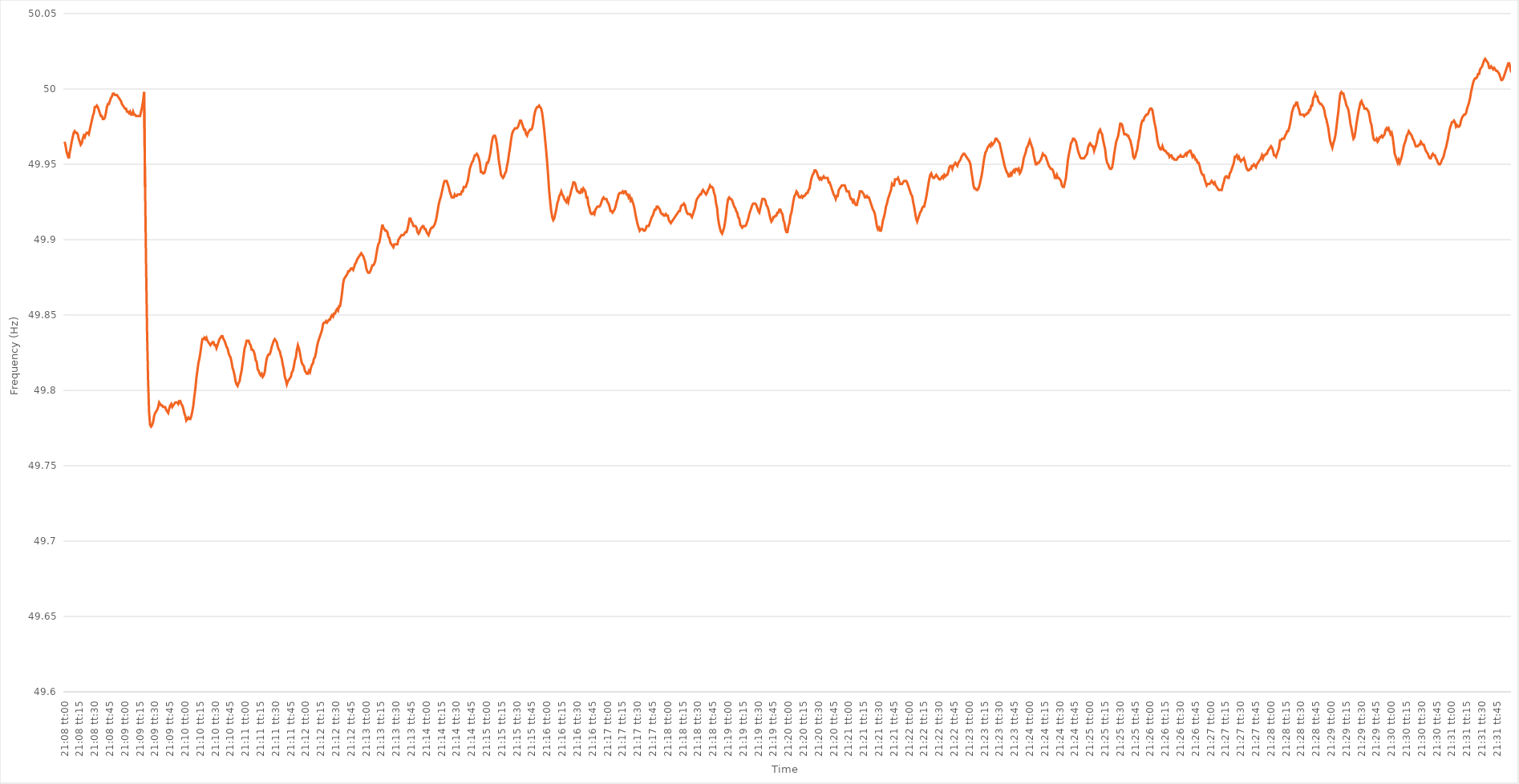
| Category | Series 0 |
|---|---|
| 0.8805555555555555 | 49.965 |
| 0.8805671296296297 | 49.962 |
| 0.8805787037037037 | 49.958 |
| 0.8805902777777778 | 49.956 |
| 0.8806018518518518 | 49.954 |
| 0.880613425925926 | 49.958 |
| 0.8806250000000001 | 49.961 |
| 0.880636574074074 | 49.965 |
| 0.8806481481481482 | 49.968 |
| 0.8806597222222222 | 49.971 |
| 0.8806712962962964 | 49.972 |
| 0.8806828703703703 | 49.971 |
| 0.8806944444444444 | 49.971 |
| 0.8807060185185186 | 49.97 |
| 0.8807175925925925 | 49.967 |
| 0.8807291666666667 | 49.965 |
| 0.8807407407407407 | 49.963 |
| 0.8807523148148149 | 49.964 |
| 0.8807638888888888 | 49.967 |
| 0.8807754629629629 | 49.969 |
| 0.8807870370370371 | 49.968 |
| 0.8807986111111111 | 49.97 |
| 0.8808101851851852 | 49.971 |
| 0.8808217592592592 | 49.971 |
| 0.8808333333333334 | 49.97 |
| 0.8808449074074075 | 49.973 |
| 0.8808564814814814 | 49.976 |
| 0.8808680555555556 | 49.979 |
| 0.8808796296296296 | 49.982 |
| 0.8808912037037038 | 49.984 |
| 0.8809027777777777 | 49.988 |
| 0.8809143518518519 | 49.988 |
| 0.880925925925926 | 49.989 |
| 0.8809374999999999 | 49.988 |
| 0.8809490740740741 | 49.986 |
| 0.8809606481481481 | 49.984 |
| 0.8809722222222223 | 49.982 |
| 0.8809837962962962 | 49.982 |
| 0.8809953703703703 | 49.98 |
| 0.8810069444444445 | 49.98 |
| 0.8810185185185185 | 49.981 |
| 0.8810300925925926 | 49.984 |
| 0.8810416666666666 | 49.988 |
| 0.8810532407407408 | 49.99 |
| 0.8810648148148149 | 49.99 |
| 0.8810763888888888 | 49.992 |
| 0.881087962962963 | 49.994 |
| 0.881099537037037 | 49.995 |
| 0.8811111111111112 | 49.997 |
| 0.8811226851851851 | 49.997 |
| 0.8811342592592593 | 49.996 |
| 0.8811458333333334 | 49.996 |
| 0.8811574074074073 | 49.996 |
| 0.8811689814814815 | 49.995 |
| 0.8811805555555555 | 49.994 |
| 0.8811921296296297 | 49.993 |
| 0.8812037037037036 | 49.992 |
| 0.8812152777777778 | 49.99 |
| 0.8812268518518519 | 49.989 |
| 0.8812384259259259 | 49.988 |
| 0.88125 | 49.987 |
| 0.881261574074074 | 49.987 |
| 0.8812731481481482 | 49.985 |
| 0.8812847222222223 | 49.985 |
| 0.8812962962962962 | 49.984 |
| 0.8813078703703704 | 49.985 |
| 0.8813194444444444 | 49.983 |
| 0.8813310185185186 | 49.983 |
| 0.8813425925925925 | 49.985 |
| 0.8813541666666667 | 49.983 |
| 0.8813657407407408 | 49.983 |
| 0.8813773148148148 | 49.982 |
| 0.8813888888888889 | 49.982 |
| 0.8814004629629629 | 49.982 |
| 0.8814120370370371 | 49.982 |
| 0.881423611111111 | 49.982 |
| 0.8814351851851852 | 49.985 |
| 0.8814467592592593 | 49.988 |
| 0.8814583333333333 | 49.992 |
| 0.8814699074074074 | 49.998 |
| 0.8814814814814814 | 49.935 |
| 0.8814930555555556 | 49.883 |
| 0.8815046296296297 | 49.838 |
| 0.8815162037037036 | 49.806 |
| 0.8815277777777778 | 49.785 |
| 0.8815393518518518 | 49.777 |
| 0.881550925925926 | 49.776 |
| 0.8815624999999999 | 49.777 |
| 0.8815740740740741 | 49.779 |
| 0.8815856481481482 | 49.783 |
| 0.8815972222222223 | 49.785 |
| 0.8816087962962963 | 49.786 |
| 0.8816203703703703 | 49.787 |
| 0.8816319444444445 | 49.789 |
| 0.8816435185185184 | 49.792 |
| 0.8816550925925926 | 49.791 |
| 0.8816666666666667 | 49.79 |
| 0.8816782407407407 | 49.79 |
| 0.8816898148148148 | 49.789 |
| 0.8817013888888888 | 49.789 |
| 0.881712962962963 | 49.789 |
| 0.8817245370370371 | 49.787 |
| 0.881736111111111 | 49.786 |
| 0.8817476851851852 | 49.785 |
| 0.8817592592592592 | 49.788 |
| 0.8817708333333334 | 49.79 |
| 0.8817824074074073 | 49.791 |
| 0.8817939814814815 | 49.789 |
| 0.8818055555555556 | 49.79 |
| 0.8818171296296297 | 49.791 |
| 0.8818287037037037 | 49.792 |
| 0.8818402777777777 | 49.792 |
| 0.8818518518518519 | 49.792 |
| 0.881863425925926 | 49.791 |
| 0.881875 | 49.793 |
| 0.8818865740740741 | 49.793 |
| 0.8818981481481482 | 49.791 |
| 0.8819097222222222 | 49.79 |
| 0.8819212962962962 | 49.788 |
| 0.8819328703703704 | 49.785 |
| 0.8819444444444445 | 49.783 |
| 0.8819560185185185 | 49.78 |
| 0.8819675925925926 | 49.781 |
| 0.8819791666666666 | 49.782 |
| 0.8819907407407408 | 49.781 |
| 0.8820023148148147 | 49.781 |
| 0.8820138888888889 | 49.783 |
| 0.882025462962963 | 49.786 |
| 0.8820370370370371 | 49.79 |
| 0.8820486111111111 | 49.796 |
| 0.8820601851851851 | 49.801 |
| 0.8820717592592593 | 49.808 |
| 0.8820833333333334 | 49.813 |
| 0.8820949074074074 | 49.818 |
| 0.8821064814814815 | 49.821 |
| 0.8821180555555556 | 49.825 |
| 0.8821296296296296 | 49.83 |
| 0.8821412037037036 | 49.834 |
| 0.8821527777777778 | 49.834 |
| 0.8821643518518519 | 49.835 |
| 0.8821759259259259 | 49.834 |
| 0.8821875 | 49.835 |
| 0.882199074074074 | 49.833 |
| 0.8822106481481482 | 49.832 |
| 0.8822222222222221 | 49.831 |
| 0.8822337962962963 | 49.83 |
| 0.8822453703703704 | 49.831 |
| 0.8822569444444445 | 49.832 |
| 0.8822685185185185 | 49.832 |
| 0.8822800925925925 | 49.83 |
| 0.8822916666666667 | 49.83 |
| 0.8823032407407408 | 49.828 |
| 0.8823148148148148 | 49.83 |
| 0.8823263888888889 | 49.832 |
| 0.882337962962963 | 49.834 |
| 0.882349537037037 | 49.835 |
| 0.882361111111111 | 49.836 |
| 0.8823726851851852 | 49.836 |
| 0.8823842592592593 | 49.834 |
| 0.8823958333333333 | 49.833 |
| 0.8824074074074074 | 49.831 |
| 0.8824189814814815 | 49.829 |
| 0.8824305555555556 | 49.828 |
| 0.8824421296296295 | 49.825 |
| 0.8824537037037037 | 49.823 |
| 0.8824652777777778 | 49.822 |
| 0.8824768518518519 | 49.819 |
| 0.8824884259259259 | 49.815 |
| 0.8825 | 49.813 |
| 0.8825115740740741 | 49.81 |
| 0.8825231481481483 | 49.806 |
| 0.8825347222222222 | 49.804 |
| 0.8825462962962963 | 49.803 |
| 0.8825578703703704 | 49.805 |
| 0.8825694444444445 | 49.806 |
| 0.8825810185185184 | 49.81 |
| 0.8825925925925926 | 49.813 |
| 0.8826041666666667 | 49.818 |
| 0.8826157407407407 | 49.823 |
| 0.8826273148148148 | 49.828 |
| 0.8826388888888889 | 49.83 |
| 0.882650462962963 | 49.833 |
| 0.8826620370370369 | 49.833 |
| 0.8826736111111111 | 49.833 |
| 0.8826851851851852 | 49.831 |
| 0.8826967592592593 | 49.83 |
| 0.8827083333333333 | 49.827 |
| 0.8827199074074074 | 49.827 |
| 0.8827314814814815 | 49.826 |
| 0.8827430555555557 | 49.824 |
| 0.8827546296296296 | 49.82 |
| 0.8827662037037037 | 49.819 |
| 0.8827777777777778 | 49.814 |
| 0.8827893518518519 | 49.813 |
| 0.8828009259259259 | 49.811 |
| 0.8828125 | 49.81 |
| 0.8828240740740741 | 49.811 |
| 0.8828356481481481 | 49.809 |
| 0.8828472222222222 | 49.81 |
| 0.8828587962962963 | 49.812 |
| 0.8828703703703704 | 49.817 |
| 0.8828819444444443 | 49.821 |
| 0.8828935185185185 | 49.823 |
| 0.8829050925925926 | 49.824 |
| 0.8829166666666667 | 49.824 |
| 0.8829282407407407 | 49.826 |
| 0.8829398148148148 | 49.829 |
| 0.8829513888888889 | 49.831 |
| 0.8829629629629631 | 49.833 |
| 0.882974537037037 | 49.834 |
| 0.8829861111111111 | 49.833 |
| 0.8829976851851852 | 49.832 |
| 0.8830092592592593 | 49.829 |
| 0.8830208333333333 | 49.827 |
| 0.8830324074074074 | 49.826 |
| 0.8830439814814816 | 49.823 |
| 0.8830555555555555 | 49.821 |
| 0.8830671296296296 | 49.817 |
| 0.8830787037037037 | 49.814 |
| 0.8830902777777778 | 49.809 |
| 0.8831018518518517 | 49.807 |
| 0.8831134259259259 | 49.804 |
| 0.883125 | 49.806 |
| 0.8831365740740741 | 49.807 |
| 0.8831481481481481 | 49.808 |
| 0.8831597222222222 | 49.809 |
| 0.8831712962962963 | 49.812 |
| 0.8831828703703705 | 49.813 |
| 0.8831944444444444 | 49.816 |
| 0.8832060185185185 | 49.82 |
| 0.8832175925925926 | 49.822 |
| 0.8832291666666667 | 49.827 |
| 0.8832407407407407 | 49.83 |
| 0.8832523148148148 | 49.828 |
| 0.883263888888889 | 49.825 |
| 0.883275462962963 | 49.821 |
| 0.883287037037037 | 49.818 |
| 0.8832986111111111 | 49.817 |
| 0.8833101851851852 | 49.816 |
| 0.8833217592592592 | 49.813 |
| 0.8833333333333333 | 49.812 |
| 0.8833449074074075 | 49.811 |
| 0.8833564814814815 | 49.811 |
| 0.8833680555555555 | 49.813 |
| 0.8833796296296296 | 49.812 |
| 0.8833912037037037 | 49.815 |
| 0.8834027777777779 | 49.817 |
| 0.8834143518518518 | 49.818 |
| 0.883425925925926 | 49.821 |
| 0.8834375 | 49.822 |
| 0.8834490740740741 | 49.825 |
| 0.8834606481481481 | 49.829 |
| 0.8834722222222222 | 49.832 |
| 0.8834837962962964 | 49.834 |
| 0.8834953703703704 | 49.836 |
| 0.8835069444444444 | 49.838 |
| 0.8835185185185185 | 49.84 |
| 0.8835300925925926 | 49.844 |
| 0.8835416666666666 | 49.845 |
| 0.8835532407407407 | 49.845 |
| 0.8835648148148149 | 49.846 |
| 0.8835763888888889 | 49.845 |
| 0.8835879629629629 | 49.846 |
| 0.883599537037037 | 49.847 |
| 0.8836111111111111 | 49.847 |
| 0.8836226851851853 | 49.849 |
| 0.8836342592592592 | 49.85 |
| 0.8836458333333334 | 49.849 |
| 0.8836574074074074 | 49.851 |
| 0.8836689814814815 | 49.851 |
| 0.8836805555555555 | 49.853 |
| 0.8836921296296296 | 49.854 |
| 0.8837037037037038 | 49.853 |
| 0.8837152777777778 | 49.856 |
| 0.8837268518518518 | 49.856 |
| 0.8837384259259259 | 49.86 |
| 0.88375 | 49.865 |
| 0.883761574074074 | 49.871 |
| 0.8837731481481481 | 49.874 |
| 0.8837847222222223 | 49.875 |
| 0.8837962962962963 | 49.876 |
| 0.8838078703703703 | 49.877 |
| 0.8838194444444444 | 49.879 |
| 0.8838310185185185 | 49.879 |
| 0.8838425925925927 | 49.88 |
| 0.8838541666666666 | 49.881 |
| 0.8838657407407408 | 49.881 |
| 0.8838773148148148 | 49.88 |
| 0.883888888888889 | 49.882 |
| 0.8839004629629629 | 49.884 |
| 0.883912037037037 | 49.885 |
| 0.8839236111111112 | 49.887 |
| 0.8839351851851852 | 49.888 |
| 0.8839467592592593 | 49.889 |
| 0.8839583333333333 | 49.89 |
| 0.8839699074074074 | 49.891 |
| 0.8839814814814816 | 49.89 |
| 0.8839930555555555 | 49.889 |
| 0.8840046296296297 | 49.887 |
| 0.8840162037037037 | 49.885 |
| 0.8840277777777777 | 49.881 |
| 0.8840393518518518 | 49.879 |
| 0.8840509259259259 | 49.878 |
| 0.8840625000000001 | 49.878 |
| 0.884074074074074 | 49.879 |
| 0.8840856481481482 | 49.881 |
| 0.8840972222222222 | 49.883 |
| 0.8841087962962964 | 49.883 |
| 0.8841203703703703 | 49.884 |
| 0.8841319444444444 | 49.886 |
| 0.8841435185185186 | 49.89 |
| 0.8841550925925926 | 49.894 |
| 0.8841666666666667 | 49.897 |
| 0.8841782407407407 | 49.898 |
| 0.8841898148148148 | 49.902 |
| 0.884201388888889 | 49.906 |
| 0.8842129629629629 | 49.91 |
| 0.8842245370370371 | 49.908 |
| 0.8842361111111111 | 49.907 |
| 0.8842476851851852 | 49.906 |
| 0.8842592592592592 | 49.906 |
| 0.8842708333333333 | 49.905 |
| 0.8842824074074075 | 49.902 |
| 0.8842939814814814 | 49.901 |
| 0.8843055555555556 | 49.898 |
| 0.8843171296296296 | 49.897 |
| 0.8843287037037038 | 49.896 |
| 0.8843402777777777 | 49.895 |
| 0.8843518518518518 | 49.897 |
| 0.884363425925926 | 49.897 |
| 0.884375 | 49.897 |
| 0.8843865740740741 | 49.897 |
| 0.8843981481481481 | 49.9 |
| 0.8844097222222222 | 49.901 |
| 0.8844212962962964 | 49.902 |
| 0.8844328703703703 | 49.903 |
| 0.8844444444444445 | 49.903 |
| 0.8844560185185185 | 49.903 |
| 0.8844675925925927 | 49.904 |
| 0.8844791666666666 | 49.905 |
| 0.8844907407407407 | 49.905 |
| 0.8845023148148149 | 49.907 |
| 0.8845138888888888 | 49.91 |
| 0.884525462962963 | 49.914 |
| 0.884537037037037 | 49.914 |
| 0.8845486111111112 | 49.912 |
| 0.8845601851851851 | 49.911 |
| 0.8845717592592592 | 49.909 |
| 0.8845833333333334 | 49.909 |
| 0.8845949074074074 | 49.909 |
| 0.8846064814814815 | 49.908 |
| 0.8846180555555555 | 49.905 |
| 0.8846296296296297 | 49.904 |
| 0.8846412037037038 | 49.905 |
| 0.8846527777777777 | 49.907 |
| 0.8846643518518519 | 49.908 |
| 0.8846759259259259 | 49.909 |
| 0.8846875000000001 | 49.909 |
| 0.884699074074074 | 49.907 |
| 0.8847106481481481 | 49.907 |
| 0.8847222222222223 | 49.905 |
| 0.8847337962962962 | 49.904 |
| 0.8847453703703704 | 49.903 |
| 0.8847569444444444 | 49.905 |
| 0.8847685185185186 | 49.907 |
| 0.8847800925925925 | 49.908 |
| 0.8847916666666666 | 49.908 |
| 0.8848032407407408 | 49.909 |
| 0.8848148148148148 | 49.91 |
| 0.8848263888888889 | 49.912 |
| 0.8848379629629629 | 49.915 |
| 0.8848495370370371 | 49.919 |
| 0.8848611111111112 | 49.923 |
| 0.8848726851851851 | 49.926 |
| 0.8848842592592593 | 49.928 |
| 0.8848958333333333 | 49.931 |
| 0.8849074074074075 | 49.934 |
| 0.8849189814814814 | 49.937 |
| 0.8849305555555556 | 49.939 |
| 0.8849421296296297 | 49.939 |
| 0.8849537037037036 | 49.939 |
| 0.8849652777777778 | 49.937 |
| 0.8849768518518518 | 49.935 |
| 0.884988425925926 | 49.932 |
| 0.8849999999999999 | 49.93 |
| 0.885011574074074 | 49.928 |
| 0.8850231481481482 | 49.928 |
| 0.8850347222222222 | 49.928 |
| 0.8850462962962963 | 49.93 |
| 0.8850578703703703 | 49.929 |
| 0.8850694444444445 | 49.929 |
| 0.8850810185185186 | 49.93 |
| 0.8850925925925925 | 49.93 |
| 0.8851041666666667 | 49.93 |
| 0.8851157407407407 | 49.93 |
| 0.8851273148148149 | 49.932 |
| 0.8851388888888888 | 49.932 |
| 0.885150462962963 | 49.935 |
| 0.8851620370370371 | 49.935 |
| 0.8851736111111111 | 49.935 |
| 0.8851851851851852 | 49.937 |
| 0.8851967592592592 | 49.939 |
| 0.8852083333333334 | 49.943 |
| 0.8852199074074073 | 49.947 |
| 0.8852314814814815 | 49.949 |
| 0.8852430555555556 | 49.951 |
| 0.8852546296296296 | 49.952 |
| 0.8852662037037037 | 49.954 |
| 0.8852777777777777 | 49.956 |
| 0.8852893518518519 | 49.956 |
| 0.885300925925926 | 49.957 |
| 0.8853125 | 49.956 |
| 0.8853240740740741 | 49.954 |
| 0.8853356481481481 | 49.951 |
| 0.8853472222222223 | 49.945 |
| 0.8853587962962962 | 49.945 |
| 0.8853703703703704 | 49.944 |
| 0.8853819444444445 | 49.944 |
| 0.8853935185185186 | 49.945 |
| 0.8854050925925926 | 49.948 |
| 0.8854166666666666 | 49.951 |
| 0.8854282407407408 | 49.951 |
| 0.8854398148148147 | 49.953 |
| 0.8854513888888889 | 49.956 |
| 0.885462962962963 | 49.96 |
| 0.885474537037037 | 49.965 |
| 0.8854861111111111 | 49.968 |
| 0.8854976851851851 | 49.969 |
| 0.8855092592592593 | 49.969 |
| 0.8855208333333334 | 49.967 |
| 0.8855324074074074 | 49.963 |
| 0.8855439814814815 | 49.958 |
| 0.8855555555555555 | 49.952 |
| 0.8855671296296297 | 49.948 |
| 0.8855787037037036 | 49.943 |
| 0.8855902777777778 | 49.942 |
| 0.8856018518518519 | 49.941 |
| 0.885613425925926 | 49.942 |
| 0.885625 | 49.944 |
| 0.885636574074074 | 49.945 |
| 0.8856481481481482 | 49.949 |
| 0.8856597222222221 | 49.952 |
| 0.8856712962962963 | 49.957 |
| 0.8856828703703704 | 49.961 |
| 0.8856944444444445 | 49.966 |
| 0.8857060185185185 | 49.97 |
| 0.8857175925925925 | 49.972 |
| 0.8857291666666667 | 49.973 |
| 0.8857407407407408 | 49.974 |
| 0.8857523148148148 | 49.974 |
| 0.8857638888888889 | 49.974 |
| 0.885775462962963 | 49.975 |
| 0.8857870370370371 | 49.977 |
| 0.885798611111111 | 49.979 |
| 0.8858101851851852 | 49.979 |
| 0.8858217592592593 | 49.977 |
| 0.8858333333333334 | 49.975 |
| 0.8858449074074074 | 49.973 |
| 0.8858564814814814 | 49.973 |
| 0.8858680555555556 | 49.97 |
| 0.8858796296296297 | 49.969 |
| 0.8858912037037037 | 49.971 |
| 0.8859027777777778 | 49.972 |
| 0.8859143518518519 | 49.973 |
| 0.8859259259259259 | 49.973 |
| 0.8859374999999999 | 49.974 |
| 0.8859490740740741 | 49.977 |
| 0.8859606481481482 | 49.982 |
| 0.8859722222222222 | 49.985 |
| 0.8859837962962963 | 49.987 |
| 0.8859953703703703 | 49.988 |
| 0.8860069444444445 | 49.988 |
| 0.8860185185185184 | 49.989 |
| 0.8860300925925926 | 49.988 |
| 0.8860416666666667 | 49.987 |
| 0.8860532407407408 | 49.984 |
| 0.8860648148148148 | 49.979 |
| 0.8860763888888888 | 49.973 |
| 0.886087962962963 | 49.966 |
| 0.8860995370370371 | 49.959 |
| 0.8861111111111111 | 49.951 |
| 0.8861226851851852 | 49.942 |
| 0.8861342592592593 | 49.932 |
| 0.8861458333333333 | 49.925 |
| 0.8861574074074073 | 49.919 |
| 0.8861689814814815 | 49.915 |
| 0.8861805555555556 | 49.913 |
| 0.8861921296296296 | 49.914 |
| 0.8862037037037037 | 49.917 |
| 0.8862152777777778 | 49.92 |
| 0.8862268518518519 | 49.924 |
| 0.8862384259259258 | 49.926 |
| 0.88625 | 49.929 |
| 0.8862615740740741 | 49.93 |
| 0.8862731481481482 | 49.932 |
| 0.8862847222222222 | 49.93 |
| 0.8862962962962962 | 49.929 |
| 0.8863078703703704 | 49.927 |
| 0.8863194444444445 | 49.926 |
| 0.8863310185185185 | 49.925 |
| 0.8863425925925926 | 49.927 |
| 0.8863541666666667 | 49.925 |
| 0.8863657407407407 | 49.928 |
| 0.8863773148148147 | 49.93 |
| 0.8863888888888889 | 49.933 |
| 0.886400462962963 | 49.935 |
| 0.886412037037037 | 49.938 |
| 0.8864236111111111 | 49.938 |
| 0.8864351851851852 | 49.937 |
| 0.8864467592592593 | 49.934 |
| 0.8864583333333332 | 49.932 |
| 0.8864699074074074 | 49.932 |
| 0.8864814814814815 | 49.931 |
| 0.8864930555555556 | 49.931 |
| 0.8865046296296296 | 49.933 |
| 0.8865162037037037 | 49.932 |
| 0.8865277777777778 | 49.934 |
| 0.886539351851852 | 49.933 |
| 0.8865509259259259 | 49.932 |
| 0.8865625 | 49.928 |
| 0.8865740740740741 | 49.928 |
| 0.8865856481481482 | 49.923 |
| 0.8865972222222221 | 49.921 |
| 0.8866087962962963 | 49.918 |
| 0.8866203703703704 | 49.917 |
| 0.8866319444444444 | 49.917 |
| 0.8866435185185185 | 49.918 |
| 0.8866550925925926 | 49.917 |
| 0.8866666666666667 | 49.92 |
| 0.8866782407407406 | 49.921 |
| 0.8866898148148148 | 49.922 |
| 0.8867013888888889 | 49.922 |
| 0.886712962962963 | 49.922 |
| 0.886724537037037 | 49.923 |
| 0.8867361111111111 | 49.925 |
| 0.8867476851851852 | 49.927 |
| 0.8867592592592594 | 49.928 |
| 0.8867708333333333 | 49.927 |
| 0.8867824074074074 | 49.927 |
| 0.8867939814814815 | 49.927 |
| 0.8868055555555556 | 49.925 |
| 0.8868171296296296 | 49.924 |
| 0.8868287037037037 | 49.922 |
| 0.8868402777777779 | 49.919 |
| 0.8868518518518518 | 49.919 |
| 0.8868634259259259 | 49.918 |
| 0.886875 | 49.919 |
| 0.8868865740740741 | 49.92 |
| 0.886898148148148 | 49.922 |
| 0.8869097222222222 | 49.925 |
| 0.8869212962962963 | 49.927 |
| 0.8869328703703704 | 49.93 |
| 0.8869444444444444 | 49.931 |
| 0.8869560185185185 | 49.931 |
| 0.8869675925925926 | 49.931 |
| 0.8869791666666668 | 49.932 |
| 0.8869907407407407 | 49.931 |
| 0.8870023148148148 | 49.932 |
| 0.8870138888888889 | 49.932 |
| 0.887025462962963 | 49.93 |
| 0.887037037037037 | 49.93 |
| 0.8870486111111111 | 49.928 |
| 0.8870601851851853 | 49.929 |
| 0.8870717592592593 | 49.926 |
| 0.8870833333333333 | 49.927 |
| 0.8870949074074074 | 49.925 |
| 0.8871064814814815 | 49.923 |
| 0.8871180555555555 | 49.92 |
| 0.8871296296296296 | 49.916 |
| 0.8871412037037038 | 49.913 |
| 0.8871527777777778 | 49.91 |
| 0.8871643518518518 | 49.908 |
| 0.8871759259259259 | 49.906 |
| 0.8871875 | 49.907 |
| 0.8871990740740742 | 49.907 |
| 0.8872106481481481 | 49.907 |
| 0.8872222222222222 | 49.906 |
| 0.8872337962962963 | 49.906 |
| 0.8872453703703704 | 49.907 |
| 0.8872569444444444 | 49.909 |
| 0.8872685185185185 | 49.909 |
| 0.8872800925925927 | 49.909 |
| 0.8872916666666667 | 49.911 |
| 0.8873032407407407 | 49.913 |
| 0.8873148148148148 | 49.915 |
| 0.8873263888888889 | 49.916 |
| 0.8873379629629629 | 49.918 |
| 0.887349537037037 | 49.92 |
| 0.8873611111111112 | 49.92 |
| 0.8873726851851852 | 49.922 |
| 0.8873842592592592 | 49.922 |
| 0.8873958333333333 | 49.921 |
| 0.8874074074074074 | 49.92 |
| 0.8874189814814816 | 49.918 |
| 0.8874305555555555 | 49.917 |
| 0.8874421296296297 | 49.917 |
| 0.8874537037037037 | 49.916 |
| 0.8874652777777778 | 49.916 |
| 0.8874768518518518 | 49.917 |
| 0.8874884259259259 | 49.916 |
| 0.8875000000000001 | 49.916 |
| 0.8875115740740741 | 49.913 |
| 0.8875231481481481 | 49.912 |
| 0.8875347222222222 | 49.911 |
| 0.8875462962962963 | 49.912 |
| 0.8875578703703703 | 49.913 |
| 0.8875694444444444 | 49.914 |
| 0.8875810185185186 | 49.915 |
| 0.8875925925925926 | 49.916 |
| 0.8876041666666666 | 49.917 |
| 0.8876157407407407 | 49.918 |
| 0.8876273148148148 | 49.919 |
| 0.887638888888889 | 49.919 |
| 0.8876504629629629 | 49.922 |
| 0.887662037037037 | 49.923 |
| 0.8876736111111111 | 49.923 |
| 0.8876851851851852 | 49.924 |
| 0.8876967592592592 | 49.923 |
| 0.8877083333333333 | 49.92 |
| 0.8877199074074075 | 49.918 |
| 0.8877314814814815 | 49.917 |
| 0.8877430555555555 | 49.917 |
| 0.8877546296296296 | 49.917 |
| 0.8877662037037037 | 49.916 |
| 0.8877777777777777 | 49.915 |
| 0.8877893518518518 | 49.917 |
| 0.887800925925926 | 49.919 |
| 0.8878125 | 49.921 |
| 0.887824074074074 | 49.925 |
| 0.8878356481481481 | 49.927 |
| 0.8878472222222222 | 49.928 |
| 0.8878587962962964 | 49.929 |
| 0.8878703703703703 | 49.93 |
| 0.8878819444444445 | 49.93 |
| 0.8878935185185185 | 49.932 |
| 0.8879050925925926 | 49.933 |
| 0.8879166666666666 | 49.932 |
| 0.8879282407407407 | 49.931 |
| 0.8879398148148149 | 49.93 |
| 0.8879513888888889 | 49.931 |
| 0.887962962962963 | 49.933 |
| 0.887974537037037 | 49.934 |
| 0.8879861111111111 | 49.936 |
| 0.8879976851851853 | 49.935 |
| 0.8880092592592592 | 49.935 |
| 0.8880208333333334 | 49.934 |
| 0.8880324074074074 | 49.931 |
| 0.8880439814814814 | 49.929 |
| 0.8880555555555555 | 49.924 |
| 0.8880671296296296 | 49.921 |
| 0.8880787037037038 | 49.914 |
| 0.8880902777777777 | 49.91 |
| 0.8881018518518519 | 49.907 |
| 0.8881134259259259 | 49.905 |
| 0.888125 | 49.904 |
| 0.888136574074074 | 49.906 |
| 0.8881481481481481 | 49.908 |
| 0.8881597222222223 | 49.912 |
| 0.8881712962962963 | 49.917 |
| 0.8881828703703704 | 49.923 |
| 0.8881944444444444 | 49.927 |
| 0.8882060185185185 | 49.928 |
| 0.8882175925925927 | 49.927 |
| 0.8882291666666666 | 49.927 |
| 0.8882407407407408 | 49.926 |
| 0.8882523148148148 | 49.924 |
| 0.888263888888889 | 49.922 |
| 0.8882754629629629 | 49.921 |
| 0.888287037037037 | 49.919 |
| 0.8882986111111112 | 49.918 |
| 0.8883101851851851 | 49.915 |
| 0.8883217592592593 | 49.914 |
| 0.8883333333333333 | 49.91 |
| 0.8883449074074075 | 49.909 |
| 0.8883564814814814 | 49.908 |
| 0.8883680555555555 | 49.909 |
| 0.8883796296296297 | 49.909 |
| 0.8883912037037037 | 49.909 |
| 0.8884027777777778 | 49.91 |
| 0.8884143518518518 | 49.912 |
| 0.888425925925926 | 49.914 |
| 0.8884375000000001 | 49.917 |
| 0.888449074074074 | 49.919 |
| 0.8884606481481482 | 49.921 |
| 0.8884722222222222 | 49.923 |
| 0.8884837962962964 | 49.924 |
| 0.8884953703703703 | 49.924 |
| 0.8885069444444444 | 49.924 |
| 0.8885185185185186 | 49.923 |
| 0.8885300925925925 | 49.921 |
| 0.8885416666666667 | 49.919 |
| 0.8885532407407407 | 49.918 |
| 0.8885648148148149 | 49.921 |
| 0.8885763888888888 | 49.924 |
| 0.8885879629629629 | 49.927 |
| 0.8885995370370371 | 49.927 |
| 0.8886111111111111 | 49.927 |
| 0.8886226851851852 | 49.926 |
| 0.8886342592592592 | 49.923 |
| 0.8886458333333334 | 49.922 |
| 0.8886574074074075 | 49.92 |
| 0.8886689814814814 | 49.917 |
| 0.8886805555555556 | 49.914 |
| 0.8886921296296296 | 49.912 |
| 0.8887037037037038 | 49.913 |
| 0.8887152777777777 | 49.915 |
| 0.8887268518518519 | 49.915 |
| 0.888738425925926 | 49.916 |
| 0.8887499999999999 | 49.916 |
| 0.8887615740740741 | 49.918 |
| 0.8887731481481481 | 49.918 |
| 0.8887847222222223 | 49.92 |
| 0.8887962962962962 | 49.92 |
| 0.8888078703703703 | 49.918 |
| 0.8888194444444445 | 49.917 |
| 0.8888310185185185 | 49.913 |
| 0.8888425925925926 | 49.911 |
| 0.8888541666666666 | 49.907 |
| 0.8888657407407408 | 49.905 |
| 0.8888773148148149 | 49.905 |
| 0.8888888888888888 | 49.909 |
| 0.888900462962963 | 49.911 |
| 0.888912037037037 | 49.916 |
| 0.8889236111111112 | 49.918 |
| 0.8889351851851851 | 49.922 |
| 0.8889467592592593 | 49.926 |
| 0.8889583333333334 | 49.929 |
| 0.8889699074074073 | 49.93 |
| 0.8889814814814815 | 49.932 |
| 0.8889930555555555 | 49.931 |
| 0.8890046296296297 | 49.929 |
| 0.8890162037037036 | 49.928 |
| 0.8890277777777778 | 49.928 |
| 0.8890393518518519 | 49.929 |
| 0.8890509259259259 | 49.928 |
| 0.8890625 | 49.929 |
| 0.889074074074074 | 49.929 |
| 0.8890856481481482 | 49.93 |
| 0.8890972222222223 | 49.931 |
| 0.8891087962962962 | 49.931 |
| 0.8891203703703704 | 49.933 |
| 0.8891319444444444 | 49.934 |
| 0.8891435185185186 | 49.938 |
| 0.8891550925925925 | 49.941 |
| 0.8891666666666667 | 49.943 |
| 0.8891782407407408 | 49.944 |
| 0.8891898148148148 | 49.946 |
| 0.8892013888888889 | 49.946 |
| 0.8892129629629629 | 49.945 |
| 0.8892245370370371 | 49.943 |
| 0.889236111111111 | 49.941 |
| 0.8892476851851852 | 49.94 |
| 0.8892592592592593 | 49.941 |
| 0.8892708333333333 | 49.94 |
| 0.8892824074074074 | 49.941 |
| 0.8892939814814814 | 49.942 |
| 0.8893055555555556 | 49.941 |
| 0.8893171296296297 | 49.941 |
| 0.8893287037037036 | 49.941 |
| 0.8893402777777778 | 49.941 |
| 0.8893518518518518 | 49.938 |
| 0.889363425925926 | 49.938 |
| 0.8893749999999999 | 49.936 |
| 0.8893865740740741 | 49.934 |
| 0.8893981481481482 | 49.932 |
| 0.8894097222222223 | 49.93 |
| 0.8894212962962963 | 49.929 |
| 0.8894328703703703 | 49.927 |
| 0.8894444444444445 | 49.929 |
| 0.8894560185185184 | 49.929 |
| 0.8894675925925926 | 49.933 |
| 0.8894791666666667 | 49.934 |
| 0.8894907407407407 | 49.935 |
| 0.8895023148148148 | 49.936 |
| 0.8895138888888888 | 49.936 |
| 0.889525462962963 | 49.936 |
| 0.8895370370370371 | 49.936 |
| 0.889548611111111 | 49.934 |
| 0.8895601851851852 | 49.932 |
| 0.8895717592592592 | 49.932 |
| 0.8895833333333334 | 49.932 |
| 0.8895949074074073 | 49.929 |
| 0.8896064814814815 | 49.927 |
| 0.8896180555555556 | 49.927 |
| 0.8896296296296297 | 49.925 |
| 0.8896412037037037 | 49.926 |
| 0.8896527777777777 | 49.924 |
| 0.8896643518518519 | 49.923 |
| 0.889675925925926 | 49.923 |
| 0.8896875 | 49.926 |
| 0.8896990740740741 | 49.928 |
| 0.8897106481481482 | 49.932 |
| 0.8897222222222222 | 49.932 |
| 0.8897337962962962 | 49.932 |
| 0.8897453703703704 | 49.931 |
| 0.8897569444444445 | 49.93 |
| 0.8897685185185185 | 49.928 |
| 0.8897800925925926 | 49.928 |
| 0.8897916666666666 | 49.929 |
| 0.8898032407407408 | 49.928 |
| 0.8898148148148147 | 49.928 |
| 0.8898263888888889 | 49.926 |
| 0.889837962962963 | 49.924 |
| 0.8898495370370371 | 49.922 |
| 0.8898611111111111 | 49.92 |
| 0.8898726851851851 | 49.919 |
| 0.8898842592592593 | 49.917 |
| 0.8898958333333334 | 49.913 |
| 0.8899074074074074 | 49.909 |
| 0.8899189814814815 | 49.907 |
| 0.8899305555555556 | 49.908 |
| 0.8899421296296296 | 49.906 |
| 0.8899537037037036 | 49.906 |
| 0.8899652777777778 | 49.909 |
| 0.8899768518518519 | 49.913 |
| 0.8899884259259259 | 49.915 |
| 0.89 | 49.918 |
| 0.890011574074074 | 49.922 |
| 0.8900231481481482 | 49.924 |
| 0.8900347222222221 | 49.927 |
| 0.8900462962962963 | 49.929 |
| 0.8900578703703704 | 49.931 |
| 0.8900694444444445 | 49.933 |
| 0.8900810185185185 | 49.937 |
| 0.8900925925925925 | 49.936 |
| 0.8901041666666667 | 49.936 |
| 0.8901157407407408 | 49.94 |
| 0.8901273148148148 | 49.94 |
| 0.8901388888888889 | 49.94 |
| 0.890150462962963 | 49.941 |
| 0.890162037037037 | 49.939 |
| 0.890173611111111 | 49.937 |
| 0.8901851851851852 | 49.937 |
| 0.8901967592592593 | 49.937 |
| 0.8902083333333333 | 49.938 |
| 0.8902199074074074 | 49.939 |
| 0.8902314814814815 | 49.939 |
| 0.8902430555555556 | 49.939 |
| 0.8902546296296295 | 49.938 |
| 0.8902662037037037 | 49.936 |
| 0.8902777777777778 | 49.934 |
| 0.8902893518518519 | 49.932 |
| 0.8903009259259259 | 49.93 |
| 0.8903125 | 49.929 |
| 0.8903240740740741 | 49.925 |
| 0.8903356481481483 | 49.922 |
| 0.8903472222222222 | 49.918 |
| 0.8903587962962963 | 49.914 |
| 0.8903703703703704 | 49.912 |
| 0.8903819444444444 | 49.914 |
| 0.8903935185185184 | 49.916 |
| 0.8904050925925926 | 49.918 |
| 0.8904166666666667 | 49.919 |
| 0.8904282407407407 | 49.921 |
| 0.8904398148148148 | 49.922 |
| 0.8904513888888889 | 49.922 |
| 0.890462962962963 | 49.925 |
| 0.8904745370370369 | 49.928 |
| 0.8904861111111111 | 49.932 |
| 0.8904976851851852 | 49.936 |
| 0.8905092592592593 | 49.94 |
| 0.8905208333333333 | 49.943 |
| 0.8905324074074074 | 49.944 |
| 0.8905439814814815 | 49.942 |
| 0.8905555555555557 | 49.941 |
| 0.8905671296296296 | 49.941 |
| 0.8905787037037037 | 49.942 |
| 0.8905902777777778 | 49.943 |
| 0.8906018518518519 | 49.942 |
| 0.8906134259259259 | 49.941 |
| 0.890625 | 49.94 |
| 0.8906365740740741 | 49.94 |
| 0.8906481481481481 | 49.941 |
| 0.8906597222222222 | 49.942 |
| 0.8906712962962963 | 49.941 |
| 0.8906828703703704 | 49.943 |
| 0.8906944444444443 | 49.942 |
| 0.8907060185185185 | 49.943 |
| 0.8907175925925926 | 49.943 |
| 0.8907291666666667 | 49.945 |
| 0.8907407407407407 | 49.948 |
| 0.8907523148148148 | 49.949 |
| 0.8907638888888889 | 49.949 |
| 0.8907754629629631 | 49.947 |
| 0.890787037037037 | 49.949 |
| 0.8907986111111111 | 49.95 |
| 0.8908101851851852 | 49.951 |
| 0.8908217592592593 | 49.95 |
| 0.8908333333333333 | 49.949 |
| 0.8908449074074074 | 49.951 |
| 0.8908564814814816 | 49.952 |
| 0.8908680555555556 | 49.953 |
| 0.8908796296296296 | 49.955 |
| 0.8908912037037037 | 49.956 |
| 0.8909027777777778 | 49.957 |
| 0.8909143518518517 | 49.957 |
| 0.8909259259259259 | 49.956 |
| 0.8909375 | 49.955 |
| 0.8909490740740741 | 49.954 |
| 0.8909606481481481 | 49.953 |
| 0.8909722222222222 | 49.952 |
| 0.8909837962962963 | 49.95 |
| 0.8909953703703705 | 49.945 |
| 0.8910069444444444 | 49.941 |
| 0.8910185185185185 | 49.936 |
| 0.8910300925925926 | 49.934 |
| 0.8910416666666667 | 49.934 |
| 0.8910532407407407 | 49.933 |
| 0.8910648148148148 | 49.933 |
| 0.891076388888889 | 49.934 |
| 0.891087962962963 | 49.936 |
| 0.891099537037037 | 49.939 |
| 0.8911111111111111 | 49.942 |
| 0.8911226851851852 | 49.946 |
| 0.8911342592592592 | 49.951 |
| 0.8911458333333333 | 49.955 |
| 0.8911574074074075 | 49.958 |
| 0.8911689814814815 | 49.959 |
| 0.8911805555555555 | 49.961 |
| 0.8911921296296296 | 49.962 |
| 0.8912037037037037 | 49.963 |
| 0.8912152777777779 | 49.962 |
| 0.8912268518518518 | 49.964 |
| 0.891238425925926 | 49.963 |
| 0.89125 | 49.964 |
| 0.8912615740740741 | 49.965 |
| 0.8912731481481481 | 49.967 |
| 0.8912847222222222 | 49.967 |
| 0.8912962962962964 | 49.966 |
| 0.8913078703703704 | 49.965 |
| 0.8913194444444444 | 49.964 |
| 0.8913310185185185 | 49.961 |
| 0.8913425925925926 | 49.958 |
| 0.8913541666666666 | 49.955 |
| 0.8913657407407407 | 49.952 |
| 0.8913773148148149 | 49.949 |
| 0.8913888888888889 | 49.947 |
| 0.8914004629629629 | 49.945 |
| 0.891412037037037 | 49.944 |
| 0.8914236111111111 | 49.942 |
| 0.8914351851851853 | 49.942 |
| 0.8914467592592592 | 49.944 |
| 0.8914583333333334 | 49.943 |
| 0.8914699074074074 | 49.945 |
| 0.8914814814814815 | 49.946 |
| 0.8914930555555555 | 49.945 |
| 0.8915046296296296 | 49.947 |
| 0.8915162037037038 | 49.947 |
| 0.8915277777777778 | 49.946 |
| 0.8915393518518518 | 49.947 |
| 0.8915509259259259 | 49.944 |
| 0.8915625 | 49.945 |
| 0.891574074074074 | 49.947 |
| 0.8915856481481481 | 49.95 |
| 0.8915972222222223 | 49.954 |
| 0.8916087962962963 | 49.956 |
| 0.8916203703703703 | 49.958 |
| 0.8916319444444444 | 49.961 |
| 0.8916435185185185 | 49.962 |
| 0.8916550925925927 | 49.964 |
| 0.8916666666666666 | 49.966 |
| 0.8916782407407408 | 49.964 |
| 0.8916898148148148 | 49.962 |
| 0.891701388888889 | 49.96 |
| 0.8917129629629629 | 49.956 |
| 0.891724537037037 | 49.953 |
| 0.8917361111111112 | 49.95 |
| 0.8917476851851852 | 49.95 |
| 0.8917592592592593 | 49.951 |
| 0.8917708333333333 | 49.951 |
| 0.8917824074074074 | 49.952 |
| 0.8917939814814816 | 49.953 |
| 0.8918055555555555 | 49.955 |
| 0.8918171296296297 | 49.957 |
| 0.8918287037037037 | 49.956 |
| 0.8918402777777777 | 49.956 |
| 0.8918518518518518 | 49.955 |
| 0.8918634259259259 | 49.953 |
| 0.8918750000000001 | 49.951 |
| 0.891886574074074 | 49.949 |
| 0.8918981481481482 | 49.948 |
| 0.8919097222222222 | 49.947 |
| 0.8919212962962964 | 49.947 |
| 0.8919328703703703 | 49.946 |
| 0.8919444444444444 | 49.944 |
| 0.8919560185185186 | 49.941 |
| 0.8919675925925926 | 49.941 |
| 0.8919791666666667 | 49.943 |
| 0.8919907407407407 | 49.941 |
| 0.8920023148148148 | 49.941 |
| 0.892013888888889 | 49.94 |
| 0.8920254629629629 | 49.939 |
| 0.8920370370370371 | 49.936 |
| 0.8920486111111111 | 49.935 |
| 0.8920601851851852 | 49.935 |
| 0.8920717592592592 | 49.938 |
| 0.8920833333333333 | 49.941 |
| 0.8920949074074075 | 49.947 |
| 0.8921064814814814 | 49.953 |
| 0.8921180555555556 | 49.957 |
| 0.8921296296296296 | 49.96 |
| 0.8921412037037038 | 49.964 |
| 0.8921527777777777 | 49.965 |
| 0.8921643518518518 | 49.967 |
| 0.892175925925926 | 49.967 |
| 0.8921875 | 49.966 |
| 0.8921990740740741 | 49.965 |
| 0.8922106481481481 | 49.962 |
| 0.8922222222222222 | 49.959 |
| 0.8922337962962964 | 49.957 |
| 0.8922453703703703 | 49.955 |
| 0.8922569444444445 | 49.954 |
| 0.8922685185185185 | 49.954 |
| 0.8922800925925927 | 49.954 |
| 0.8922916666666666 | 49.954 |
| 0.8923032407407407 | 49.955 |
| 0.8923148148148149 | 49.956 |
| 0.8923263888888888 | 49.957 |
| 0.892337962962963 | 49.961 |
| 0.892349537037037 | 49.963 |
| 0.8923611111111112 | 49.964 |
| 0.8923726851851851 | 49.963 |
| 0.8923842592592592 | 49.962 |
| 0.8923958333333334 | 49.962 |
| 0.8924074074074074 | 49.959 |
| 0.8924189814814815 | 49.961 |
| 0.8924305555555555 | 49.963 |
| 0.8924421296296297 | 49.966 |
| 0.8924537037037038 | 49.97 |
| 0.8924652777777777 | 49.972 |
| 0.8924768518518519 | 49.973 |
| 0.8924884259259259 | 49.971 |
| 0.8925000000000001 | 49.97 |
| 0.892511574074074 | 49.966 |
| 0.8925231481481481 | 49.963 |
| 0.8925347222222223 | 49.96 |
| 0.8925462962962962 | 49.954 |
| 0.8925578703703704 | 49.951 |
| 0.8925694444444444 | 49.95 |
| 0.8925810185185186 | 49.948 |
| 0.8925925925925925 | 49.947 |
| 0.8926041666666666 | 49.947 |
| 0.8926157407407408 | 49.948 |
| 0.8926273148148148 | 49.952 |
| 0.8926388888888889 | 49.957 |
| 0.8926504629629629 | 49.961 |
| 0.8926620370370371 | 49.965 |
| 0.8926736111111112 | 49.967 |
| 0.8926851851851851 | 49.969 |
| 0.8926967592592593 | 49.973 |
| 0.8927083333333333 | 49.977 |
| 0.8927199074074075 | 49.977 |
| 0.8927314814814814 | 49.976 |
| 0.8927430555555556 | 49.973 |
| 0.8927546296296297 | 49.97 |
| 0.8927662037037036 | 49.97 |
| 0.8927777777777778 | 49.97 |
| 0.8927893518518518 | 49.969 |
| 0.892800925925926 | 49.969 |
| 0.8928124999999999 | 49.967 |
| 0.892824074074074 | 49.966 |
| 0.8928356481481482 | 49.963 |
| 0.8928472222222222 | 49.96 |
| 0.8928587962962963 | 49.955 |
| 0.8928703703703703 | 49.954 |
| 0.8928819444444445 | 49.955 |
| 0.8928935185185186 | 49.958 |
| 0.8929050925925925 | 49.96 |
| 0.8929166666666667 | 49.965 |
| 0.8929282407407407 | 49.968 |
| 0.8929398148148149 | 49.973 |
| 0.8929513888888888 | 49.977 |
| 0.892962962962963 | 49.979 |
| 0.8929745370370371 | 49.979 |
| 0.892986111111111 | 49.981 |
| 0.8929976851851852 | 49.982 |
| 0.8930092592592592 | 49.983 |
| 0.8930208333333334 | 49.983 |
| 0.8930324074074073 | 49.984 |
| 0.8930439814814815 | 49.986 |
| 0.8930555555555556 | 49.987 |
| 0.8930671296296296 | 49.987 |
| 0.8930787037037037 | 49.986 |
| 0.8930902777777777 | 49.982 |
| 0.8931018518518519 | 49.978 |
| 0.893113425925926 | 49.975 |
| 0.893125 | 49.971 |
| 0.8931365740740741 | 49.966 |
| 0.8931481481481481 | 49.963 |
| 0.8931597222222223 | 49.961 |
| 0.8931712962962962 | 49.96 |
| 0.8931828703703704 | 49.96 |
| 0.8931944444444445 | 49.962 |
| 0.8932060185185186 | 49.96 |
| 0.8932175925925926 | 49.959 |
| 0.8932291666666666 | 49.959 |
| 0.8932407407407408 | 49.958 |
| 0.8932523148148147 | 49.957 |
| 0.8932638888888889 | 49.957 |
| 0.893275462962963 | 49.955 |
| 0.893287037037037 | 49.956 |
| 0.8932986111111111 | 49.956 |
| 0.8933101851851851 | 49.954 |
| 0.8933217592592593 | 49.954 |
| 0.8933333333333334 | 49.953 |
| 0.8933449074074074 | 49.953 |
| 0.8933564814814815 | 49.953 |
| 0.8933680555555555 | 49.954 |
| 0.8933796296296297 | 49.955 |
| 0.8933912037037036 | 49.955 |
| 0.8934027777777778 | 49.956 |
| 0.8934143518518519 | 49.955 |
| 0.893425925925926 | 49.955 |
| 0.8934375 | 49.955 |
| 0.893449074074074 | 49.956 |
| 0.8934606481481482 | 49.957 |
| 0.8934722222222223 | 49.956 |
| 0.8934837962962963 | 49.958 |
| 0.8934953703703704 | 49.958 |
| 0.8935069444444445 | 49.959 |
| 0.8935185185185185 | 49.959 |
| 0.8935300925925925 | 49.957 |
| 0.8935416666666667 | 49.955 |
| 0.8935532407407408 | 49.956 |
| 0.8935648148148148 | 49.955 |
| 0.8935763888888889 | 49.953 |
| 0.893587962962963 | 49.953 |
| 0.8935995370370371 | 49.951 |
| 0.893611111111111 | 49.951 |
| 0.8936226851851852 | 49.949 |
| 0.8936342592592593 | 49.946 |
| 0.8936458333333334 | 49.944 |
| 0.8936574074074074 | 49.943 |
| 0.8936689814814814 | 49.943 |
| 0.8936805555555556 | 49.94 |
| 0.8936921296296297 | 49.938 |
| 0.8937037037037037 | 49.936 |
| 0.8937152777777778 | 49.937 |
| 0.8937268518518519 | 49.937 |
| 0.8937384259259259 | 49.937 |
| 0.8937499999999999 | 49.938 |
| 0.8937615740740741 | 49.939 |
| 0.8937731481481482 | 49.938 |
| 0.8937847222222222 | 49.937 |
| 0.8937962962962963 | 49.938 |
| 0.8938078703703703 | 49.936 |
| 0.8938194444444445 | 49.935 |
| 0.8938310185185184 | 49.934 |
| 0.8938425925925926 | 49.933 |
| 0.8938541666666667 | 49.933 |
| 0.8938657407407408 | 49.933 |
| 0.8938773148148148 | 49.933 |
| 0.8938888888888888 | 49.936 |
| 0.893900462962963 | 49.938 |
| 0.8939120370370371 | 49.941 |
| 0.8939236111111111 | 49.942 |
| 0.8939351851851852 | 49.942 |
| 0.8939467592592593 | 49.941 |
| 0.8939583333333333 | 49.941 |
| 0.8939699074074073 | 49.944 |
| 0.8939814814814815 | 49.945 |
| 0.8939930555555556 | 49.947 |
| 0.8940046296296296 | 49.949 |
| 0.8940162037037037 | 49.951 |
| 0.8940277777777778 | 49.955 |
| 0.8940393518518519 | 49.955 |
| 0.8940509259259258 | 49.956 |
| 0.8940625 | 49.954 |
| 0.8940740740740741 | 49.955 |
| 0.8940856481481482 | 49.953 |
| 0.8940972222222222 | 49.952 |
| 0.8941087962962962 | 49.953 |
| 0.8941203703703704 | 49.953 |
| 0.8941319444444445 | 49.954 |
| 0.8941435185185185 | 49.952 |
| 0.8941550925925926 | 49.949 |
| 0.8941666666666667 | 49.947 |
| 0.8941782407407407 | 49.946 |
| 0.8941898148148147 | 49.946 |
| 0.8942013888888889 | 49.947 |
| 0.894212962962963 | 49.947 |
| 0.894224537037037 | 49.949 |
| 0.8942361111111111 | 49.949 |
| 0.8942476851851852 | 49.95 |
| 0.8942592592592593 | 49.949 |
| 0.8942708333333332 | 49.948 |
| 0.8942824074074074 | 49.95 |
| 0.8942939814814815 | 49.951 |
| 0.8943055555555556 | 49.952 |
| 0.8943171296296296 | 49.953 |
| 0.8943287037037037 | 49.954 |
| 0.8943402777777778 | 49.956 |
| 0.894351851851852 | 49.954 |
| 0.8943634259259259 | 49.956 |
| 0.894375 | 49.956 |
| 0.8943865740740741 | 49.957 |
| 0.8943981481481482 | 49.957 |
| 0.8944097222222221 | 49.959 |
| 0.8944212962962963 | 49.96 |
| 0.8944328703703704 | 49.961 |
| 0.8944444444444444 | 49.962 |
| 0.8944560185185185 | 49.961 |
| 0.8944675925925926 | 49.959 |
| 0.8944791666666667 | 49.956 |
| 0.8944907407407406 | 49.956 |
| 0.8945023148148148 | 49.955 |
| 0.8945138888888889 | 49.957 |
| 0.894525462962963 | 49.959 |
| 0.894537037037037 | 49.961 |
| 0.8945486111111111 | 49.966 |
| 0.8945601851851852 | 49.966 |
| 0.8945717592592594 | 49.967 |
| 0.8945833333333333 | 49.967 |
| 0.8945949074074074 | 49.967 |
| 0.8946064814814815 | 49.969 |
| 0.8946180555555556 | 49.97 |
| 0.8946296296296296 | 49.972 |
| 0.8946412037037037 | 49.972 |
| 0.8946527777777779 | 49.974 |
| 0.8946643518518518 | 49.977 |
| 0.8946759259259259 | 49.981 |
| 0.8946875 | 49.985 |
| 0.8946990740740741 | 49.987 |
| 0.894710648148148 | 49.989 |
| 0.8947222222222222 | 49.989 |
| 0.8947337962962963 | 49.991 |
| 0.8947453703703704 | 49.991 |
| 0.8947569444444444 | 49.988 |
| 0.8947685185185185 | 49.986 |
| 0.8947800925925926 | 49.983 |
| 0.8947916666666668 | 49.983 |
| 0.8948032407407407 | 49.983 |
| 0.8948148148148148 | 49.983 |
| 0.8948263888888889 | 49.982 |
| 0.894837962962963 | 49.983 |
| 0.894849537037037 | 49.983 |
| 0.8948611111111111 | 49.984 |
| 0.8948726851851853 | 49.984 |
| 0.8948842592592593 | 49.986 |
| 0.8948958333333333 | 49.986 |
| 0.8949074074074074 | 49.989 |
| 0.8949189814814815 | 49.989 |
| 0.8949305555555555 | 49.994 |
| 0.8949421296296296 | 49.995 |
| 0.8949537037037038 | 49.997 |
| 0.8949652777777778 | 49.995 |
| 0.8949768518518518 | 49.995 |
| 0.8949884259259259 | 49.992 |
| 0.895 | 49.991 |
| 0.8950115740740742 | 49.99 |
| 0.8950231481481481 | 49.99 |
| 0.8950347222222222 | 49.989 |
| 0.8950462962962963 | 49.988 |
| 0.8950578703703704 | 49.986 |
| 0.8950694444444444 | 49.982 |
| 0.8950810185185185 | 49.98 |
| 0.8950925925925927 | 49.977 |
| 0.8951041666666667 | 49.974 |
| 0.8951157407407407 | 49.969 |
| 0.8951273148148148 | 49.965 |
| 0.8951388888888889 | 49.963 |
| 0.8951504629629629 | 49.961 |
| 0.895162037037037 | 49.964 |
| 0.8951736111111112 | 49.966 |
| 0.8951851851851852 | 49.969 |
| 0.8951967592592592 | 49.974 |
| 0.8952083333333333 | 49.98 |
| 0.8952199074074074 | 49.985 |
| 0.8952314814814816 | 49.992 |
| 0.8952430555555555 | 49.997 |
| 0.8952546296296297 | 49.998 |
| 0.8952662037037037 | 49.997 |
| 0.8952777777777778 | 49.997 |
| 0.8952893518518518 | 49.994 |
| 0.8953009259259259 | 49.992 |
| 0.8953125000000001 | 49.989 |
| 0.8953240740740741 | 49.988 |
| 0.8953356481481481 | 49.986 |
| 0.8953472222222222 | 49.982 |
| 0.8953587962962963 | 49.977 |
| 0.8953703703703703 | 49.974 |
| 0.8953819444444444 | 49.97 |
| 0.8953935185185186 | 49.967 |
| 0.8954050925925926 | 49.968 |
| 0.8954166666666666 | 49.972 |
| 0.8954282407407407 | 49.977 |
| 0.8954398148148148 | 49.981 |
| 0.895451388888889 | 49.985 |
| 0.8954629629629629 | 49.988 |
| 0.895474537037037 | 49.991 |
| 0.8954861111111111 | 49.992 |
| 0.8954976851851852 | 49.99 |
| 0.8955092592592592 | 49.989 |
| 0.8955208333333333 | 49.987 |
| 0.8955324074074075 | 49.987 |
| 0.8955439814814815 | 49.987 |
| 0.8955555555555555 | 49.986 |
| 0.8955671296296296 | 49.985 |
| 0.8955787037037037 | 49.982 |
| 0.8955902777777777 | 49.978 |
| 0.8956018518518518 | 49.976 |
| 0.895613425925926 | 49.971 |
| 0.895625 | 49.967 |
| 0.895636574074074 | 49.966 |
| 0.8956481481481481 | 49.966 |
| 0.8956597222222222 | 49.967 |
| 0.8956712962962964 | 49.965 |
| 0.8956828703703703 | 49.966 |
| 0.8956944444444445 | 49.968 |
| 0.8957060185185185 | 49.968 |
| 0.8957175925925926 | 49.969 |
| 0.8957291666666666 | 49.968 |
| 0.8957407407407407 | 49.969 |
| 0.8957523148148149 | 49.97 |
| 0.8957638888888889 | 49.973 |
| 0.895775462962963 | 49.974 |
| 0.895787037037037 | 49.973 |
| 0.8957986111111111 | 49.974 |
| 0.8958101851851853 | 49.972 |
| 0.8958217592592592 | 49.97 |
| 0.8958333333333334 | 49.971 |
| 0.8958449074074074 | 49.968 |
| 0.8958564814814814 | 49.963 |
| 0.8958680555555555 | 49.957 |
| 0.8958796296296296 | 49.955 |
| 0.8958912037037038 | 49.953 |
| 0.8959027777777777 | 49.951 |
| 0.8959143518518519 | 49.953 |
| 0.8959259259259259 | 49.951 |
| 0.8959375 | 49.953 |
| 0.895949074074074 | 49.955 |
| 0.8959606481481481 | 49.958 |
| 0.8959722222222223 | 49.962 |
| 0.8959837962962963 | 49.964 |
| 0.8959953703703704 | 49.966 |
| 0.8960069444444444 | 49.969 |
| 0.8960185185185185 | 49.97 |
| 0.8960300925925927 | 49.972 |
| 0.8960416666666666 | 49.971 |
| 0.8960532407407408 | 49.97 |
| 0.8960648148148148 | 49.969 |
| 0.896076388888889 | 49.967 |
| 0.8960879629629629 | 49.966 |
| 0.896099537037037 | 49.964 |
| 0.8961111111111112 | 49.962 |
| 0.8961226851851851 | 49.962 |
| 0.8961342592592593 | 49.962 |
| 0.8961458333333333 | 49.963 |
| 0.8961574074074075 | 49.963 |
| 0.8961689814814814 | 49.965 |
| 0.8961805555555555 | 49.964 |
| 0.8961921296296297 | 49.963 |
| 0.8962037037037037 | 49.963 |
| 0.8962152777777778 | 49.961 |
| 0.8962268518518518 | 49.959 |
| 0.896238425925926 | 49.958 |
| 0.8962500000000001 | 49.957 |
| 0.896261574074074 | 49.955 |
| 0.8962731481481482 | 49.954 |
| 0.8962847222222222 | 49.954 |
| 0.8962962962962964 | 49.956 |
| 0.8963078703703703 | 49.957 |
| 0.8963194444444444 | 49.956 |
| 0.8963310185185186 | 49.956 |
| 0.8963425925925925 | 49.954 |
| 0.8963541666666667 | 49.953 |
| 0.8963657407407407 | 49.951 |
| 0.8963773148148149 | 49.95 |
| 0.8963888888888888 | 49.95 |
| 0.8964004629629629 | 49.951 |
| 0.8964120370370371 | 49.953 |
| 0.8964236111111111 | 49.954 |
| 0.8964351851851852 | 49.956 |
| 0.8964467592592592 | 49.959 |
| 0.8964583333333334 | 49.961 |
| 0.8964699074074075 | 49.964 |
| 0.8964814814814814 | 49.967 |
| 0.8964930555555556 | 49.971 |
| 0.8965046296296296 | 49.974 |
| 0.8965162037037038 | 49.976 |
| 0.8965277777777777 | 49.978 |
| 0.8965393518518519 | 49.978 |
| 0.896550925925926 | 49.979 |
| 0.8965624999999999 | 49.978 |
| 0.8965740740740741 | 49.975 |
| 0.8965856481481481 | 49.976 |
| 0.8965972222222223 | 49.975 |
| 0.8966087962962962 | 49.975 |
| 0.8966203703703703 | 49.976 |
| 0.8966319444444445 | 49.979 |
| 0.8966435185185185 | 49.981 |
| 0.8966550925925926 | 49.982 |
| 0.8966666666666666 | 49.983 |
| 0.8966782407407408 | 49.983 |
| 0.8966898148148149 | 49.984 |
| 0.8967013888888888 | 49.987 |
| 0.896712962962963 | 49.989 |
| 0.896724537037037 | 49.991 |
| 0.8967361111111112 | 49.994 |
| 0.8967476851851851 | 49.998 |
| 0.8967592592592593 | 50.001 |
| 0.8967708333333334 | 50.004 |
| 0.8967824074074073 | 50.006 |
| 0.8967939814814815 | 50.007 |
| 0.8968055555555555 | 50.007 |
| 0.8968171296296297 | 50.008 |
| 0.8968287037037036 | 50.01 |
| 0.8968402777777778 | 50.01 |
| 0.8968518518518519 | 50.013 |
| 0.8968634259259259 | 50.014 |
| 0.896875 | 50.015 |
| 0.896886574074074 | 50.017 |
| 0.8968981481481482 | 50.019 |
| 0.8969097222222223 | 50.02 |
| 0.8969212962962962 | 50.019 |
| 0.8969328703703704 | 50.018 |
| 0.8969444444444444 | 50.017 |
| 0.8969560185185186 | 50.014 |
| 0.8969675925925925 | 50.014 |
| 0.8969791666666667 | 50.015 |
| 0.8969907407407408 | 50.014 |
| 0.8970023148148148 | 50.013 |
| 0.8970138888888889 | 50.014 |
| 0.8970254629629629 | 50.013 |
| 0.8970370370370371 | 50.012 |
| 0.897048611111111 | 50.012 |
| 0.8970601851851852 | 50.011 |
| 0.8970717592592593 | 50.01 |
| 0.8970833333333333 | 50.008 |
| 0.8970949074074074 | 50.006 |
| 0.8971064814814814 | 50.006 |
| 0.8971180555555556 | 50.007 |
| 0.8971296296296297 | 50.009 |
| 0.8971412037037036 | 50.011 |
| 0.8971527777777778 | 50.013 |
| 0.8971643518518518 | 50.015 |
| 0.897175925925926 | 50.017 |
| 0.8971874999999999 | 50.017 |
| 0.8971990740740741 | 50.014 |
| 0.8972106481481482 | 50.011 |